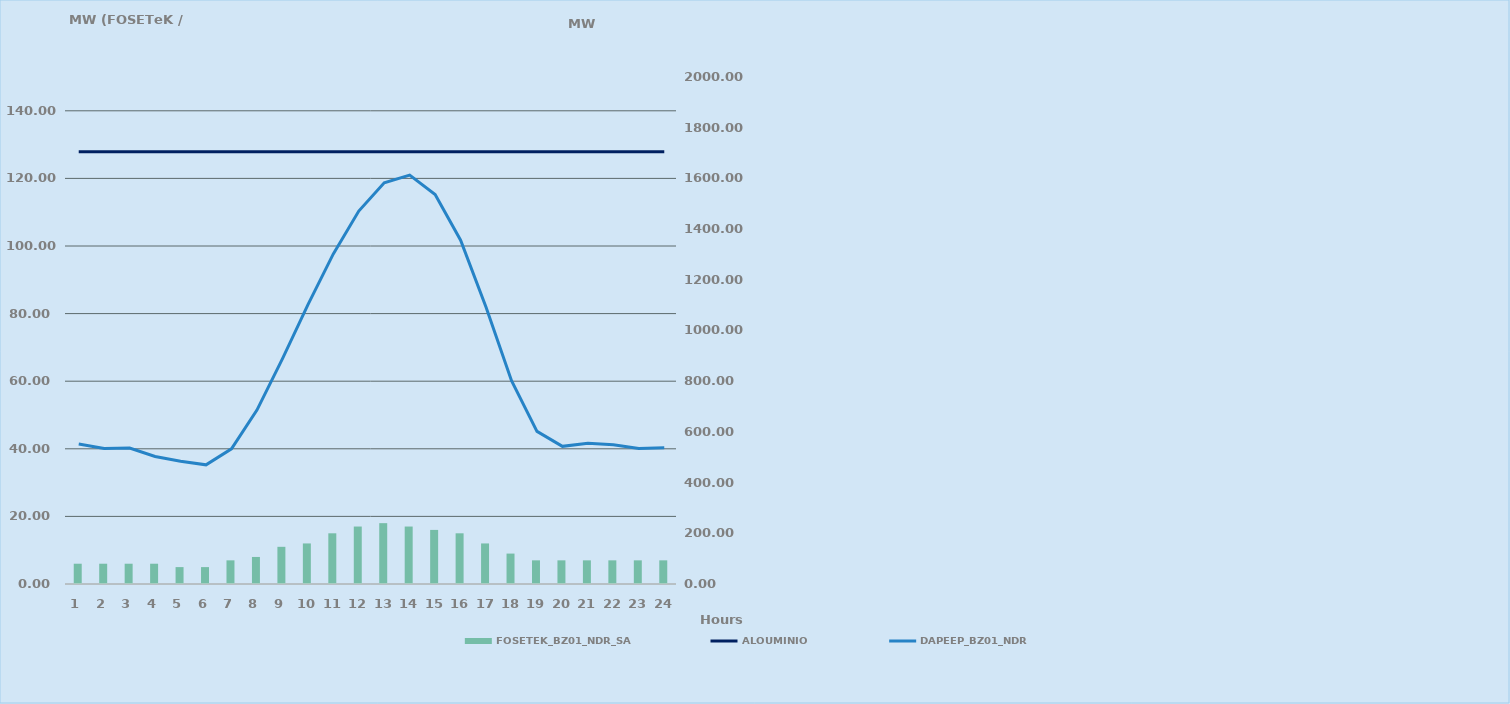
| Category | FOSETEK_BZ01_NDR_SA |
|---|---|
| 0 | 6 |
| 1 | 6 |
| 2 | 6 |
| 3 | 6 |
| 4 | 5 |
| 5 | 5 |
| 6 | 7 |
| 7 | 8 |
| 8 | 11 |
| 9 | 12 |
| 10 | 15 |
| 11 | 17 |
| 12 | 18 |
| 13 | 17 |
| 14 | 16 |
| 15 | 15 |
| 16 | 12 |
| 17 | 9 |
| 18 | 7 |
| 19 | 7 |
| 20 | 7 |
| 21 | 7 |
| 22 | 7 |
| 23 | 7 |